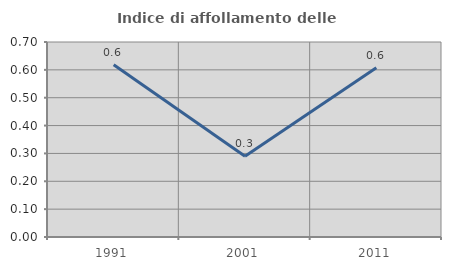
| Category | Indice di affollamento delle abitazioni  |
|---|---|
| 1991.0 | 0.618 |
| 2001.0 | 0.29 |
| 2011.0 | 0.607 |